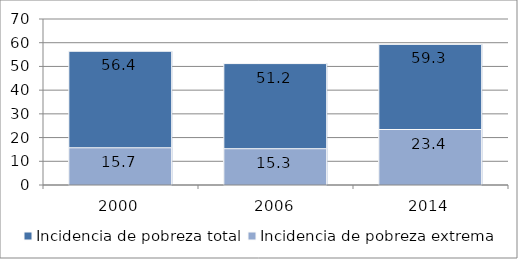
| Category | Incidencia de pobreza total | Incidencia de pobreza extrema |
|---|---|---|
| 2000.0 | 56.4 | 15.7 |
| 2006.0 | 51.2 | 15.3 |
| 2014.0 | 59.3 | 23.4 |